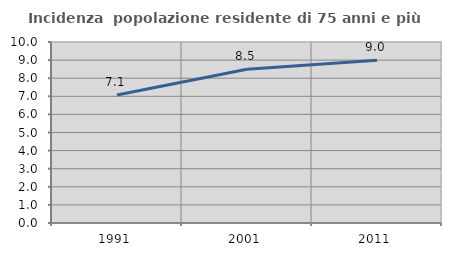
| Category | Incidenza  popolazione residente di 75 anni e più |
|---|---|
| 1991.0 | 7.072 |
| 2001.0 | 8.493 |
| 2011.0 | 8.989 |